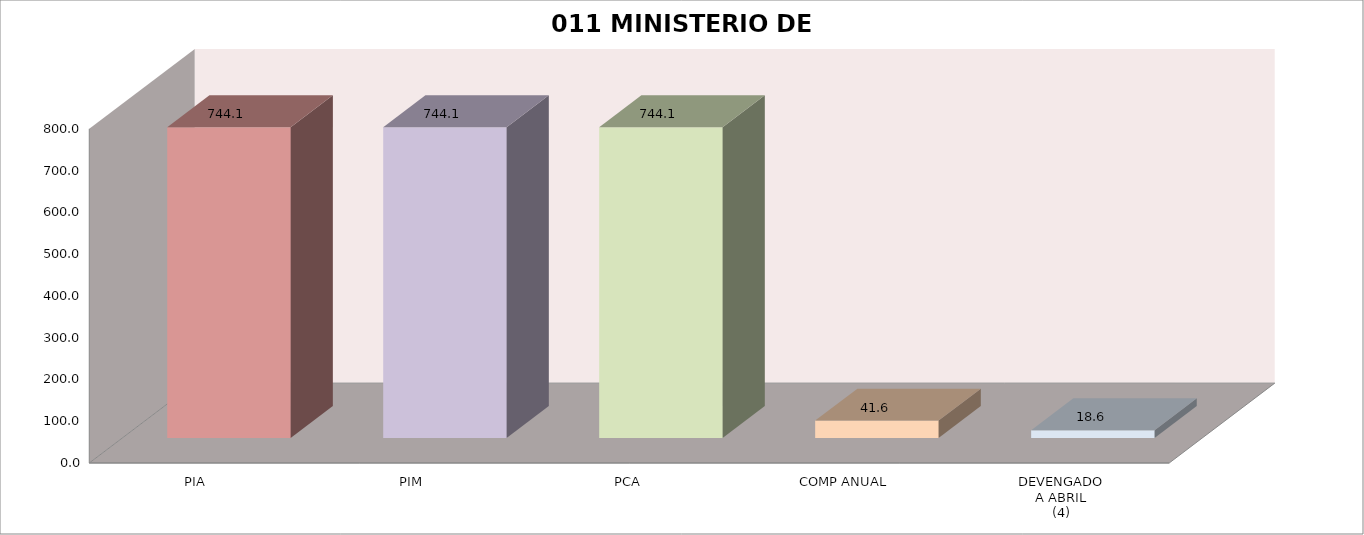
| Category | 011 MINISTERIO DE SALUD |
|---|---|
| PIA | 744.088 |
| PIM | 744.088 |
| PCA | 744.088 |
| COMP ANUAL | 41.595 |
| DEVENGADO
A ABRIL
(4) | 18.645 |